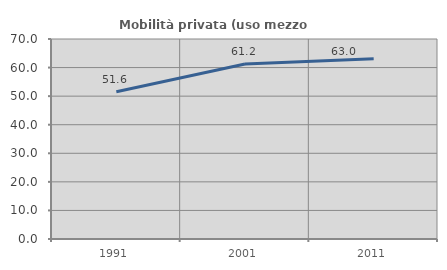
| Category | Mobilità privata (uso mezzo privato) |
|---|---|
| 1991.0 | 51.562 |
| 2001.0 | 61.248 |
| 2011.0 | 63.049 |